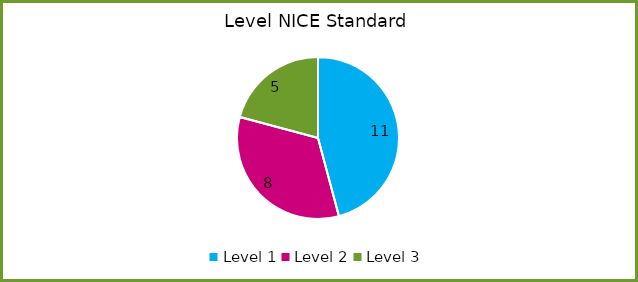
| Category | Series 0 |
|---|---|
| Level 1 | 11 |
| Level 2 | 8 |
| Level 3 | 5 |